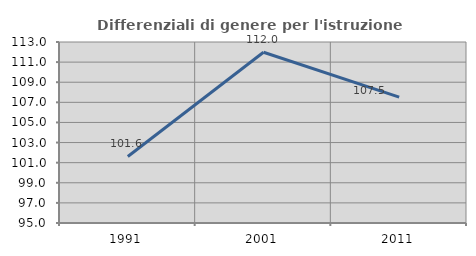
| Category | Differenziali di genere per l'istruzione superiore |
|---|---|
| 1991.0 | 101.618 |
| 2001.0 | 111.976 |
| 2011.0 | 107.519 |